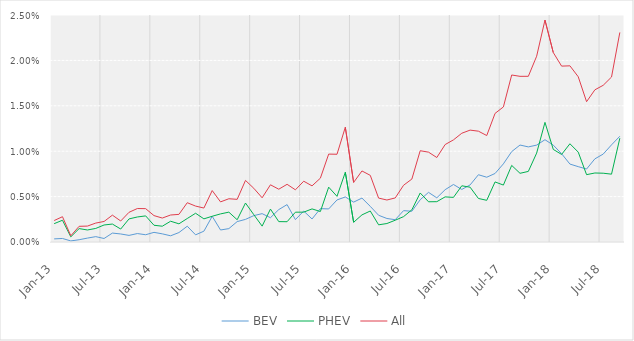
| Category | BEV | PHEV | All |
|---|---|---|---|
| 2013-01-01 | 0 | 0.002 | 0.002 |
| 2013-02-01 | 0 | 0.002 | 0.003 |
| 2013-03-01 | 0 | 0.001 | 0.001 |
| 2013-04-01 | 0 | 0.001 | 0.002 |
| 2013-05-01 | 0 | 0.001 | 0.002 |
| 2013-06-01 | 0.001 | 0.001 | 0.002 |
| 2013-07-01 | 0 | 0.002 | 0.002 |
| 2013-08-01 | 0.001 | 0.002 | 0.003 |
| 2013-09-01 | 0.001 | 0.001 | 0.002 |
| 2013-10-01 | 0.001 | 0.003 | 0.003 |
| 2013-11-01 | 0.001 | 0.003 | 0.004 |
| 2013-12-01 | 0.001 | 0.003 | 0.004 |
| 2014-01-01 | 0.001 | 0.002 | 0.003 |
| 2014-02-01 | 0.001 | 0.002 | 0.003 |
| 2014-03-01 | 0.001 | 0.002 | 0.003 |
| 2014-04-01 | 0.001 | 0.002 | 0.003 |
| 2014-05-01 | 0.002 | 0.003 | 0.004 |
| 2014-06-01 | 0.001 | 0.003 | 0.004 |
| 2014-07-01 | 0.001 | 0.003 | 0.004 |
| 2014-08-01 | 0.003 | 0.003 | 0.006 |
| 2014-09-01 | 0.001 | 0.003 | 0.004 |
| 2014-10-01 | 0.001 | 0.003 | 0.005 |
| 2014-11-01 | 0.002 | 0.002 | 0.005 |
| 2014-12-01 | 0.002 | 0.004 | 0.007 |
| 2015-01-01 | 0.003 | 0.003 | 0.006 |
| 2015-02-01 | 0.003 | 0.002 | 0.005 |
| 2015-03-01 | 0.003 | 0.004 | 0.006 |
| 2015-04-01 | 0.004 | 0.002 | 0.006 |
| 2015-05-01 | 0.004 | 0.002 | 0.006 |
| 2015-06-01 | 0.002 | 0.003 | 0.006 |
| 2015-07-01 | 0.003 | 0.003 | 0.007 |
| 2015-08-01 | 0.003 | 0.004 | 0.006 |
| 2015-09-01 | 0.004 | 0.003 | 0.007 |
| 2015-10-01 | 0.004 | 0.006 | 0.01 |
| 2015-11-01 | 0.005 | 0.005 | 0.01 |
| 2015-12-01 | 0.005 | 0.008 | 0.013 |
| 2016-01-01 | 0.004 | 0.002 | 0.007 |
| 2016-02-01 | 0.005 | 0.003 | 0.008 |
| 2016-03-01 | 0.004 | 0.003 | 0.007 |
| 2016-04-01 | 0.003 | 0.002 | 0.005 |
| 2016-05-01 | 0.003 | 0.002 | 0.005 |
| 2016-06-01 | 0.002 | 0.002 | 0.005 |
| 2016-07-01 | 0.003 | 0.003 | 0.006 |
| 2016-08-01 | 0.003 | 0.004 | 0.007 |
| 2016-09-01 | 0.005 | 0.005 | 0.01 |
| 2016-10-01 | 0.005 | 0.004 | 0.01 |
| 2016-11-01 | 0.005 | 0.004 | 0.009 |
| 2016-12-01 | 0.006 | 0.005 | 0.011 |
| 2017-01-01 | 0.006 | 0.005 | 0.011 |
| 2017-02-01 | 0.006 | 0.006 | 0.012 |
| 2017-03-01 | 0.006 | 0.006 | 0.012 |
| 2017-04-01 | 0.007 | 0.005 | 0.012 |
| 2017-05-01 | 0.007 | 0.005 | 0.012 |
| 2017-06-01 | 0.008 | 0.007 | 0.014 |
| 2017-07-01 | 0.009 | 0.006 | 0.015 |
| 2017-08-01 | 0.01 | 0.008 | 0.018 |
| 2017-09-01 | 0.011 | 0.008 | 0.018 |
| 2017-10-01 | 0.01 | 0.008 | 0.018 |
| 2017-11-01 | 0.011 | 0.01 | 0.02 |
| 2017-12-01 | 0.011 | 0.013 | 0.024 |
| 2018-01-01 | 0.011 | 0.01 | 0.021 |
| 2018-02-01 | 0.01 | 0.01 | 0.019 |
| 2018-03-01 | 0.009 | 0.011 | 0.019 |
| 2018-04-01 | 0.008 | 0.01 | 0.018 |
| 2018-05-01 | 0.008 | 0.007 | 0.015 |
| 2018-06-01 | 0.009 | 0.008 | 0.017 |
| 2018-07-01 | 0.01 | 0.008 | 0.017 |
| 2018-08-01 | 0.011 | 0.007 | 0.018 |
| 2018-09-01 | 0.012 | 0.011 | 0.023 |